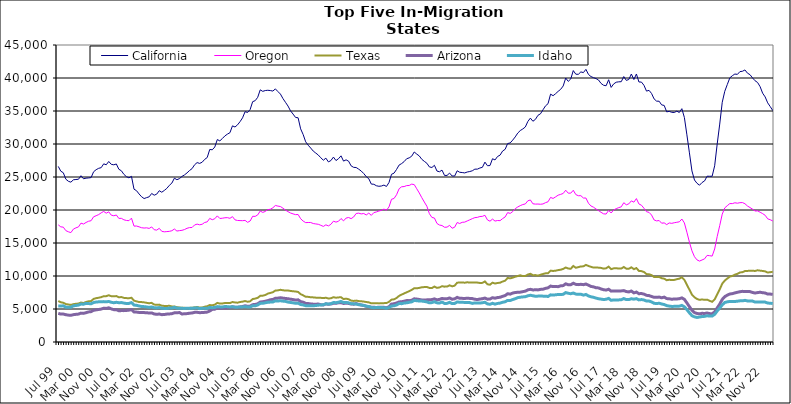
| Category | California | Oregon | Texas | Arizona | Idaho |
|---|---|---|---|---|---|
| Jul 99 | 26605 | 17749 | 6209 | 4339 | 5471 |
| Aug 99 | 25882 | 17447 | 6022 | 4228 | 5444 |
| Sep 99 | 25644 | 17401 | 5941 | 4237 | 5488 |
| Oct 99 | 24669 | 16875 | 5751 | 4134 | 5279 |
| Nov 99 | 24353 | 16701 | 5680 | 4073 | 5260 |
| Dec 99 | 24218 | 16570 | 5619 | 4042 | 5269 |
| Jan 00 | 24574 | 17109 | 5736 | 4142 | 5485 |
| Feb 00 | 24620 | 17295 | 5789 | 4192 | 5530 |
| Mar 00 | 24655 | 17436 | 5826 | 4226 | 5590 |
| Apr 00 | 25195 | 18009 | 5980 | 4375 | 5748 |
| May 00 | 24730 | 17875 | 5897 | 4337 | 5729 |
| Jun 00 | 24825 | 18113 | 6070 | 4444 | 5853 |
| Jul 00 | 24857 | 18294 | 6163 | 4555 | 5824 |
| Aug 00 | 24913 | 18376 | 6199 | 4603 | 5788 |
| Sep 00 | 25792 | 18971 | 6529 | 4804 | 5976 |
| Oct 00 | 26106 | 19135 | 6643 | 4870 | 6058 |
| Nov 00 | 26315 | 19306 | 6705 | 4926 | 6085 |
| Dec 00 | 26415 | 19570 | 6793 | 4991 | 6096 |
| Jan 01 | 26995 | 19781 | 6942 | 5122 | 6119 |
| Feb 01 | 26851 | 19519 | 6948 | 5089 | 6090 |
| Mar 01 | 27352 | 19720 | 7080 | 5180 | 6143 |
| Apr 01 | 26918 | 19221 | 6943 | 5020 | 6020 |
| May 01 | 26848 | 19126 | 6924 | 4899 | 5950 |
| Jun 01 | 26974 | 19241 | 6959 | 4895 | 6019 |
| Jul 01 | 26172 | 18725 | 6778 | 4737 | 5951 |
| Aug 01 | 25943 | 18736 | 6810 | 4757 | 5973 |
| Sep 01 | 25399 | 18514 | 6688 | 4753 | 5895 |
| Oct 01 | 25050 | 18415 | 6650 | 4780 | 5833 |
| Nov 01 | 24873 | 18381 | 6631 | 4826 | 5850 |
| Dec 01 | 25099 | 18765 | 6708 | 4898 | 5969 |
| Jan 02 | 23158 | 17561 | 6261 | 4560 | 5595 |
| Feb 02 | 22926 | 17573 | 6162 | 4531 | 5560 |
| Mar 02 | 22433 | 17452 | 6052 | 4481 | 5458 |
| Apr 02 | 22012 | 17314 | 6046 | 4458 | 5380 |
| May 02 | 21733 | 17267 | 6007 | 4452 | 5358 |
| Jun 02 | 21876 | 17298 | 5933 | 4444 | 5315 |
| Jul 02 | 21997 | 17209 | 5873 | 4383 | 5243 |
| Aug 02 | 22507 | 17436 | 5929 | 4407 | 5315 |
| Sep 02 | 22244 | 17010 | 5672 | 4248 | 5192 |
| Oct 02 | 22406 | 16952 | 5625 | 4191 | 5167 |
| Nov 02 | 22922 | 17223 | 5663 | 4242 | 5221 |
| Dec 02 | 22693 | 16770 | 5499 | 4142 | 5120 |
| Jan 03 | 22964 | 16694 | 5463 | 4166 | 5089 |
| Feb 03 | 23276 | 16727 | 5461 | 4226 | 5077 |
| Mar 03 | 23736 | 16766 | 5486 | 4251 | 5145 |
| Apr 03 | 24079 | 16859 | 5389 | 4289 | 5145 |
| May 03 | 24821 | 17117 | 5378 | 4415 | 5254 |
| Jun 03 | 24592 | 16812 | 5273 | 4426 | 5135 |
| Jul 03 | 24754 | 16875 | 5226 | 4466 | 5124 |
| Aug 03 | 25092 | 16922 | 5181 | 4244 | 5100 |
| Sep 03 | 25316 | 17036 | 5181 | 4279 | 5086 |
| Oct 03 | 25622 | 17228 | 5139 | 4301 | 5110 |
| Nov 03 | 25984 | 17335 | 5175 | 4362 | 5091 |
| Dec 03 | 26269 | 17350 | 5189 | 4396 | 5113 |
| Jan 04 | 26852 | 17734 | 5255 | 4492 | 5152 |
| Feb 04 | 27184 | 17860 | 5301 | 4502 | 5183 |
| Mar 04 | 27062 | 17757 | 5227 | 4443 | 5056 |
| Apr 04 | 27238 | 17840 | 5227 | 4461 | 5104 |
| May 04 | 27671 | 18113 | 5345 | 4493 | 5095 |
| Jun 04 | 27949 | 18201 | 5416 | 4532 | 5103 |
| Jul 04 | 29172 | 18727 | 5597 | 4697 | 5231 |
| Aug 04 | 29122 | 18529 | 5561 | 4945 | 5197 |
| Sep 04 | 29542 | 18678 | 5656 | 4976 | 5237 |
| Oct 04 | 30674 | 19108 | 5922 | 5188 | 5363 |
| Nov 04 | 30472 | 18716 | 5823 | 5106 | 5321 |
| Dec 04 | 30831 | 18755 | 5838 | 5135 | 5312 |
| Jan 05 | 31224 | 18823 | 5906 | 5155 | 5374 |
| Feb 05 | 31495 | 18842 | 5898 | 5168 | 5357 |
| Mar 05 | 31714 | 18738 | 5894 | 5212 | 5313 |
| Apr 05 | 32750 | 18998 | 6060 | 5340 | 5350 |
| May 05 | 32575 | 18504 | 5989 | 5269 | 5276 |
| Jun 05 | 32898 | 18414 | 5954 | 5252 | 5271 |
| Jul 05 | 33384 | 18395 | 6062 | 5322 | 5322 |
| Aug 05 | 33964 | 18381 | 6113 | 5375 | 5316 |
| Sep 05 | 34897 | 18426 | 6206 | 5493 | 5362 |
| Oct 05 | 34780 | 18132 | 6100 | 5408 | 5308 |
| Nov 05 | 35223 | 18332 | 6162 | 5434 | 5314 |
| Dec 05 | 36415 | 19047 | 6508 | 5658 | 5487 |
| Jan 06 | 36567 | 19032 | 6576 | 5688 | 5480 |
| Feb 06 | 37074 | 19257 | 6692 | 5792 | 5616 |
| Mar 06 | 38207 | 19845 | 6993 | 6052 | 5850 |
| Apr 06 | 37976 | 19637 | 7024 | 6101 | 5864 |
| May 06 | 38099 | 19781 | 7114 | 6178 | 5943 |
| Jun 06 | 38141 | 20061 | 7331 | 6276 | 6018 |
| Jul 06 | 38097 | 20111 | 7431 | 6399 | 6046 |
| Aug 06 | 38021 | 20333 | 7542 | 6450 | 6064 |
| Sep 06 | 38349 | 20686 | 7798 | 6627 | 6232 |
| Oct 06 | 37947 | 20591 | 7825 | 6647 | 6216 |
| Nov 06 | 37565 | 20526 | 7907 | 6707 | 6244 |
| Dec 06 | 36884 | 20272 | 7840 | 6648 | 6192 |
| Jan 07 | 36321 | 19984 | 7789 | 6597 | 6151 |
| Feb 07 | 35752 | 19752 | 7799 | 6554 | 6048 |
| Mar 07 | 35025 | 19547 | 7737 | 6487 | 5989 |
| Apr 07 | 34534 | 19412 | 7685 | 6430 | 5937 |
| May 07 | 34022 | 19296 | 7654 | 6353 | 5858 |
| Jun 07 | 33974 | 19318 | 7577 | 6390 | 5886 |
| Jul 07 | 32298 | 18677 | 7250 | 6117 | 5682 |
| Aug 07 | 31436 | 18322 | 7070 | 6034 | 5617 |
| Sep 07 | 30331 | 18087 | 6853 | 5847 | 5500 |
| Oct 07 | 29813 | 18108 | 6839 | 5821 | 5489 |
| Nov 07 | 29384 | 18105 | 6777 | 5769 | 5481 |
| Dec 07 | 28923 | 17949 | 6760 | 5733 | 5499 |
| Jan 08 | 28627 | 17890 | 6721 | 5732 | 5521 |
| Feb 08 | 28328 | 17834 | 6719 | 5749 | 5579 |
| Mar 08 | 27911 | 17680 | 6690 | 5650 | 5614 |
| Apr 08 | 27543 | 17512 | 6656 | 5612 | 5635 |
| May 08 | 27856 | 17754 | 6705 | 5774 | 5798 |
| Jun 08 | 27287 | 17589 | 6593 | 5717 | 5745 |
| Jul 08 | 27495 | 17834 | 6623 | 5761 | 5807 |
| Aug 08 | 28018 | 18309 | 6789 | 5867 | 5982 |
| Sep-08 | 27491 | 18164 | 6708 | 5864 | 5954 |
| Oct 08 | 27771 | 18291 | 6755 | 5942 | 6032 |
| Nov 08 | 28206 | 18706 | 6787 | 5970 | 6150 |
| Dec 08 | 27408 | 18353 | 6505 | 5832 | 5975 |
| Jan 09 | 27601 | 18778 | 6569 | 5890 | 5995 |
| Feb 09 | 27394 | 18863 | 6483 | 5845 | 5936 |
| Mar 09 | 26690 | 18694 | 6273 | 5751 | 5806 |
| Apr 09 | 26461 | 18943 | 6222 | 5735 | 5777 |
| May 09 | 26435 | 19470 | 6272 | 5819 | 5767 |
| Jun 09 | 26187 | 19522 | 6199 | 5700 | 5649 |
| Jul 09 | 25906 | 19408 | 6171 | 5603 | 5617 |
| Aug 09 | 25525 | 19469 | 6128 | 5533 | 5540 |
| Sep 09 | 25050 | 19249 | 6059 | 5405 | 5437 |
| Oct 09 | 24741 | 19529 | 6004 | 5349 | 5369 |
| Nov 09 | 23928 | 19187 | 5854 | 5271 | 5248 |
| Dec 09 | 23899 | 19607 | 5886 | 5261 | 5195 |
| Jan 10 | 23676 | 19703 | 5881 | 5232 | 5234 |
| Feb 10 | 23592 | 19845 | 5850 | 5272 | 5236 |
| Mar 10 | 23634 | 19946 | 5864 | 5278 | 5219 |
| Apr 10 | 23774 | 20134 | 5889 | 5257 | 5201 |
| May 10 | 23567 | 19966 | 5897 | 5172 | 5105 |
| Jun 10 | 24166 | 20464 | 6087 | 5356 | 5237 |
| Jul 10 | 25410 | 21627 | 6417 | 5742 | 5452 |
| Aug 10 | 25586 | 21744 | 6465 | 5797 | 5491 |
| Sep 10 | 26150 | 22314 | 6667 | 5907 | 5609 |
| Oct 10 | 26807 | 23219 | 6986 | 6070 | 5831 |
| Nov 10 | 27033 | 23520 | 7179 | 6100 | 5810 |
| Dec 10 | 27332 | 23551 | 7361 | 6182 | 5898 |
| Jan 11 | 27769 | 23697 | 7525 | 6276 | 5938 |
| Feb 11 | 27898 | 23718 | 7708 | 6267 | 6016 |
| Mar 11 | 28155 | 23921 | 7890 | 6330 | 6081 |
| Apr 11 | 28790 | 23847 | 8146 | 6544 | 6305 |
| May 11 | 28471 | 23215 | 8131 | 6502 | 6248 |
| Jun 11 | 28191 | 22580 | 8199 | 6445 | 6217 |
| Jul 11 | 27678 | 21867 | 8291 | 6368 | 6202 |
| Aug 11 | 27372 | 21203 | 8321 | 6356 | 6146 |
| Sep 11 | 27082 | 20570 | 8341 | 6387 | 6075 |
| Oct 11 | 26528 | 19442 | 8191 | 6402 | 5932 |
| Nov 11 | 26440 | 18872 | 8176 | 6426 | 5968 |
| Dec 11 | 26770 | 18784 | 8401 | 6533 | 6106 |
| Jan 12 | 25901 | 17963 | 8202 | 6390 | 5933 |
| Feb 12 | 25796 | 17718 | 8266 | 6456 | 5900 |
| Mar 12 | 26042 | 17647 | 8456 | 6600 | 6054 |
| Apr 12 | 25239 | 17386 | 8388 | 6534 | 5838 |
| May 12 | 25238 | 17407 | 8401 | 6558 | 5854 |
| Jun 12 | 25593 | 17673 | 8594 | 6669 | 6009 |
| Jul 12 | 25155 | 17237 | 8432 | 6474 | 5817 |
| Aug 12 | 25146 | 17391 | 8536 | 6539 | 5842 |
| Sep 12 | 25942 | 18102 | 8989 | 6759 | 6061 |
| Oct 12 | 25718 | 17953 | 9012 | 6618 | 6027 |
| Nov 12 | 25677 | 18134 | 9032 | 6611 | 6009 |
| Dec 12 | 25619 | 18166 | 8981 | 6601 | 5999 |
| Jan 13 | 25757 | 18344 | 9051 | 6627 | 5989 |
| Feb-13 | 25830 | 18512 | 9001 | 6606 | 5968 |
| Mar-13 | 25940 | 18689 | 9021 | 6577 | 5853 |
| Apr 13 | 26187 | 18844 | 9013 | 6478 | 5925 |
| May 13 | 26192 | 18884 | 9003 | 6431 | 5924 |
| Jun-13 | 26362 | 19013 | 8948 | 6508 | 5896 |
| Jul 13 | 26467 | 19037 | 8958 | 6559 | 5948 |
| Aug 13 | 27253 | 19198 | 9174 | 6655 | 6020 |
| Sep 13 | 26711 | 18501 | 8747 | 6489 | 5775 |
| Oct 13 | 26733 | 18301 | 8681 | 6511 | 5711 |
| Nov 13 | 27767 | 18620 | 8989 | 6709 | 5860 |
| Dec 13 | 27583 | 18320 | 8863 | 6637 | 5740 |
| Jan 14 | 28107 | 18409 | 8939 | 6735 | 5843 |
| Feb-14 | 28313 | 18383 | 8989 | 6779 | 5893 |
| Mar 14 | 28934 | 18696 | 9160 | 6918 | 6015 |
| Apr 14 | 29192 | 18946 | 9291 | 7036 | 6099 |
| May 14 | 30069 | 19603 | 9701 | 7314 | 6304 |
| Jun 14 | 30163 | 19487 | 9641 | 7252 | 6293 |
| Jul-14 | 30587 | 19754 | 9752 | 7415 | 6427 |
| Aug-14 | 31074 | 20201 | 9882 | 7499 | 6557 |
| Sep 14 | 31656 | 20459 | 9997 | 7536 | 6719 |
| Oct 14 | 32037 | 20663 | 10109 | 7555 | 6786 |
| Nov 14 | 32278 | 20825 | 9992 | 7628 | 6831 |
| Dec 14 | 32578 | 20918 | 10006 | 7705 | 6860 |
| Jan 15 | 33414 | 21396 | 10213 | 7906 | 7000 |
| Feb 15 | 33922 | 21518 | 10337 | 7982 | 7083 |
| Mar 15 | 33447 | 20942 | 10122 | 7891 | 7006 |
| Apr-15 | 33731 | 20893 | 10138 | 7906 | 6931 |
| May 15 | 34343 | 20902 | 10053 | 7895 | 6952 |
| Jun-15 | 34572 | 20870 | 10192 | 7973 | 6966 |
| Jul 15 | 35185 | 20916 | 10303 | 8000 | 6949 |
| Aug 15 | 35780 | 21115 | 10399 | 8126 | 6938 |
| Sep 15 | 36109 | 21246 | 10428 | 8207 | 6896 |
| Oct 15 | 37555 | 21908 | 10813 | 8477 | 7140 |
| Nov 15 | 37319 | 21750 | 10763 | 8390 | 7112 |
| Dec 15 | 37624 | 21990 | 10807 | 8395 | 7149 |
| Jan 16 | 37978 | 22248 | 10892 | 8388 | 7201 |
| Feb 16 | 38285 | 22369 | 10951 | 8508 | 7192 |
| Mar 16 | 38792 | 22506 | 11075 | 8547 | 7226 |
| Apr 16 | 39994 | 22999 | 11286 | 8815 | 7487 |
| May 16 | 39488 | 22548 | 11132 | 8673 | 7382 |
| Jun 16 | 39864 | 22556 | 11100 | 8682 | 7315 |
| Jul 16 | 41123 | 22989 | 11516 | 8903 | 7420 |
| Aug 16 | 40573 | 22333 | 11251 | 8731 | 7261 |
| Sep 16 | 40560 | 22162 | 11340 | 8692 | 7216 |
| Oct 16 | 40923 | 22172 | 11456 | 8742 | 7233 |
| Nov 16 | 40817 | 21818 | 11459 | 8685 | 7101 |
| Dec 16 | 41311 | 21815 | 11681 | 8783 | 7203 |
| Jan 17 | 40543 | 21029 | 11524 | 8609 | 6982 |
| Feb 17 | 40218 | 20613 | 11385 | 8416 | 6852 |
| Mar 17 | 40052 | 20425 | 11276 | 8354 | 6775 |
| Apr 17 | 39913 | 20147 | 11297 | 8218 | 6653 |
| May 17 | 39695 | 19910 | 11265 | 8196 | 6552 |
| Jun 17 | 39177 | 19650 | 11225 | 8034 | 6500 |
| Jul 17 | 38901 | 19419 | 11115 | 7923 | 6429 |
| Aug 17 | 38827 | 19389 | 11168 | 7867 | 6479 |
| Sep 17 | 39736 | 19936 | 11426 | 7991 | 6609 |
| Oct 17 | 38576 | 19547 | 11041 | 7708 | 6315 |
| Nov 17 | 39108 | 20013 | 11158 | 7746 | 6381 |
| Dec 17 | 39359 | 20202 | 11185 | 7743 | 6366 |
| Jan 18 | 39420 | 20362 | 11118 | 7736 | 6380 |
| Feb 18 | 39440 | 20476 | 11128 | 7741 | 6407 |
| Mar 18 | 40218 | 21106 | 11362 | 7789 | 6578 |
| Apr 18 | 39637 | 20788 | 11111 | 7642 | 6423 |
| May 18 | 39777 | 20933 | 11097 | 7591 | 6430 |
| Jun 18 | 40602 | 21381 | 11317 | 7721 | 6554 |
| Jul 18 | 39767 | 21189 | 11038 | 7445 | 6489 |
| Aug 18 | 40608 | 21729 | 11200 | 7560 | 6569 |
| Sep 18 | 39395 | 20916 | 10772 | 7318 | 6383 |
| Oct 18 | 39383 | 20724 | 10740 | 7344 | 6429 |
| Nov 18 | 38891 | 20265 | 10605 | 7255 | 6365 |
| Dec 18 | 38013 | 19741 | 10292 | 7069 | 6205 |
| Jan 19 | 38130 | 19643 | 10261 | 7032 | 6203 |
| Feb 19 | 37658 | 19237 | 10132 | 6892 | 6073 |
| Mar 19 | 36831 | 18492 | 9848 | 6766 | 5863 |
| Apr 19 | 36492 | 18349 | 9839 | 6763 | 5827 |
| May 19 | 36481 | 18407 | 9867 | 6809 | 5873 |
| Jun 19 | 35925 | 17998 | 9661 | 6698 | 5761 |
| Jul 19 | 35843 | 18049 | 9598 | 6800 | 5673 |
| Aug 19 | 34870 | 17785 | 9361 | 6577 | 5512 |
| Sep 19 | 34945 | 18038 | 9428 | 6547 | 5437 |
| Oct 19 | 34802 | 17977 | 9385 | 6483 | 5390 |
| Nov 19 | 34775 | 18072 | 9403 | 6511 | 5401 |
| Dec 19 | 34976 | 18140 | 9518 | 6521 | 5419 |
| Jan 20 | 34774 | 18209 | 9594 | 6561 | 5434 |
| Feb 20 | 35352 | 18632 | 9804 | 6682 | 5543 |
| Mar 20 | 34013 | 18041 | 9411 | 6464 | 5330 |
| Apr 20 | 31385 | 16629 | 8666 | 5922 | 4906 |
| May 20 | 28657 | 15123 | 7927 | 5355 | 4419 |
| Jun 20 | 25915 | 13817 | 7164 | 4815 | 3992 |
| Jul 20 | 24545 | 12926 | 6776 | 4457 | 3810 |
| Aug 20 | 24048 | 12443 | 6521 | 4326 | 3720 |
| Sep 20 | 23756 | 12258 | 6386 | 4266 | 3784 |
| Oct 20 | 24166 | 12429 | 6452 | 4347 | 3861 |
| Nov 20 | 24404 | 12597 | 6386 | 4324 | 3883 |
| Dec 20 | 25120 | 13122 | 6420 | 4394 | 3974 |
| Jan 21 | 25111 | 13080 | 6236 | 4304 | 3924 |
| Feb 21 | 25114 | 13015 | 6094 | 4260 | 3930 |
| Mar 21 | 26701 | 14096 | 6455 | 4567 | 4185 |
| Apr 21 | 29998 | 15978 | 7222 | 5164 | 4697 |
| May 21 | 33020 | 17641 | 7969 | 5748 | 5148 |
| Jun 21 | 36320 | 19369 | 8840 | 6450 | 5628 |
| Jul 21 | 37989 | 20320 | 9306 | 6877 | 5984 |
| Aug 21 | 39007 | 20657 | 9615 | 7094 | 6084 |
| Sep 21 | 40023 | 20974 | 9914 | 7277 | 6151 |
| Oct 21 | 40348 | 20966 | 10003 | 7327 | 6140 |
| Nov 21 | 40599 | 21096 | 10203 | 7437 | 6136 |
| Dec 21 | 40548 | 21032 | 10328 | 7532 | 6183 |
| Jan 22 | 40967 | 21106 | 10535 | 7618 | 6237 |
| Feb 22 | 41019 | 21125 | 10579 | 7673 | 6236 |
| Mar 22 | 41220 | 20949 | 10751 | 7660 | 6310 |
| Apr 22 | 40730 | 20602 | 10772 | 7661 | 6221 |
| May 22 | 40504 | 20370 | 10792 | 7636 | 6210 |
| Jun 22 | 40013 | 20127 | 10802 | 7504 | 6199 |
| Jul 22 | 39582 | 19846 | 10761 | 7419 | 6050 |
| Aug 22 | 39321 | 19865 | 10868 | 7487 | 6071 |
| Sep 22 | 38685 | 19666 | 10811 | 7536 | 6074 |
| Oct 22 | 37700 | 19450 | 10764 | 7469 | 6042 |
| Nov 22 | 37133 | 19198 | 10701 | 7425 | 6042 |
| Dec 22 | 36232 | 18659 | 10527 | 7261 | 5898 |
| Jan 23 | 35674 | 18528 | 10578 | 7263 | 5879 |
| Feb 23 | 35072 | 18344 | 10642 | 7211 | 5827 |